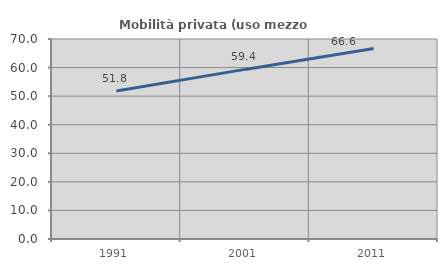
| Category | Mobilità privata (uso mezzo privato) |
|---|---|
| 1991.0 | 51.804 |
| 2001.0 | 59.362 |
| 2011.0 | 66.644 |